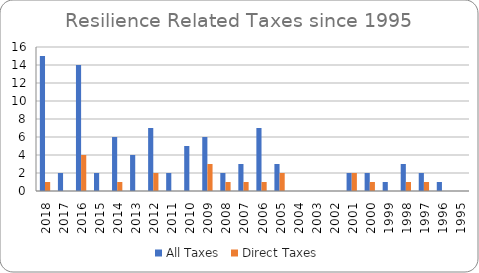
| Category | All Taxes | Direct Taxes |
|---|---|---|
| 2018.0 | 15 | 1 |
| 2017.0 | 2 | 0 |
| 2016.0 | 14 | 4 |
| 2015.0 | 2 | 0 |
| 2014.0 | 6 | 1 |
| 2013.0 | 4 | 0 |
| 2012.0 | 7 | 2 |
| 2011.0 | 2 | 0 |
| 2010.0 | 5 | 0 |
| 2009.0 | 6 | 3 |
| 2008.0 | 2 | 1 |
| 2007.0 | 3 | 1 |
| 2006.0 | 7 | 1 |
| 2005.0 | 3 | 2 |
| 2004.0 | 0 | 0 |
| 2003.0 | 0 | 0 |
| 2002.0 | 0 | 0 |
| 2001.0 | 2 | 2 |
| 2000.0 | 2 | 1 |
| 1999.0 | 1 | 0 |
| 1998.0 | 3 | 1 |
| 1997.0 | 2 | 1 |
| 1996.0 | 1 | 0 |
| 1995.0 | 0 | 0 |